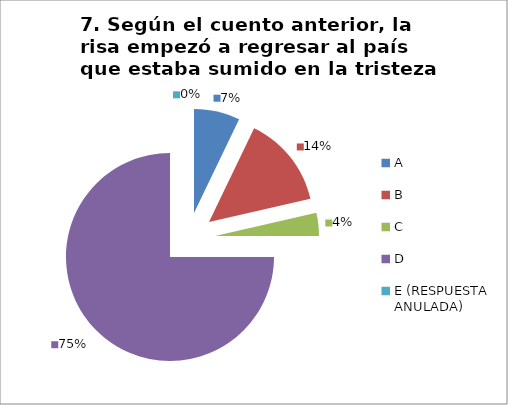
| Category | CANTIDAD DE RESPUESTAS PREGUNTA (7) | PORCENTAJE |
|---|---|---|
| A | 2 | 0.071 |
| B | 4 | 0.143 |
| C | 1 | 0.036 |
| D | 21 | 0.75 |
| E (RESPUESTA ANULADA) | 0 | 0 |